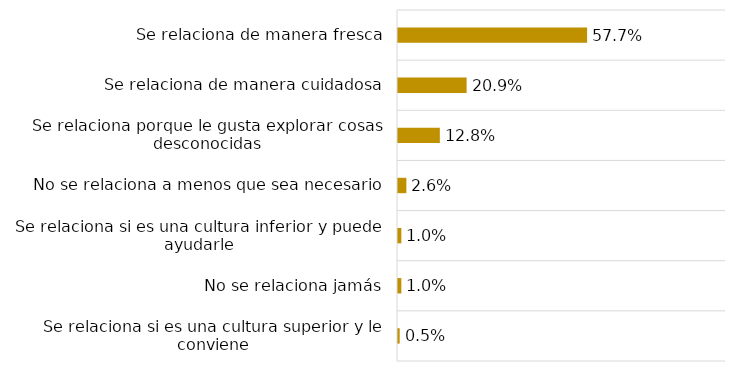
| Category | Series 0 |
|---|---|
| Se relaciona si es una cultura superior y le conviene | 0.005 |
| No se relaciona jamás | 0.01 |
| Se relaciona si es una cultura inferior y puede ayudarle | 0.01 |
| No se relaciona a menos que sea necesario | 0.026 |
| Se relaciona porque le gusta explorar cosas desconocidas | 0.128 |
| Se relaciona de manera cuidadosa | 0.209 |
| Se relaciona de manera fresca | 0.577 |